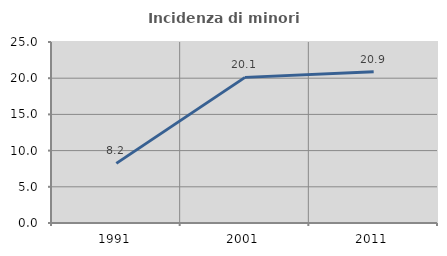
| Category | Incidenza di minori stranieri |
|---|---|
| 1991.0 | 8.235 |
| 2001.0 | 20.114 |
| 2011.0 | 20.887 |